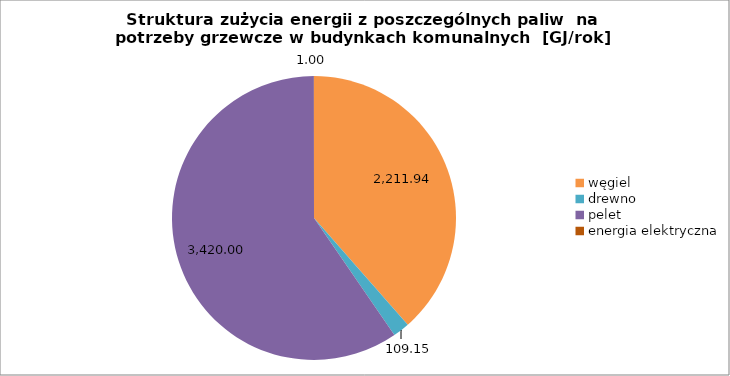
| Category | Series 0 |
|---|---|
| węgiel | 2211.944 |
| drewno | 109.153 |
| pelet | 3420 |
| energia elektryczna | 1 |